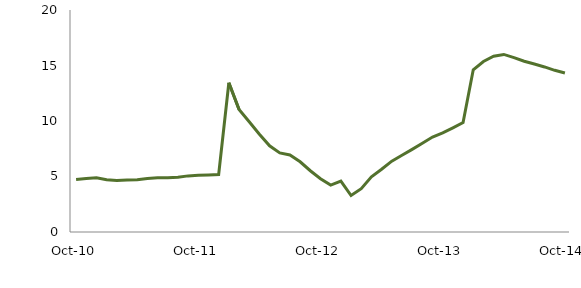
| Category | Series 0 |
|---|---|
| Oct-10 | 4.726 |
|  | 4.816 |
|  | 4.886 |
|  | 4.703 |
|  | 4.632 |
|  | 4.674 |
|  | 4.715 |
|  | 4.818 |
|  | 4.876 |
|  | 4.891 |
|  | 4.923 |
|  | 5.055 |
| Oct-11 | 5.115 |
|  | 5.14 |
|  | 5.184 |
|  | 13.448 |
|  | 11.044 |
|  | 9.928 |
|  | 8.811 |
|  | 7.762 |
|  | 7.121 |
|  | 6.936 |
|  | 6.325 |
|  | 5.519 |
| Oct-12 | 4.806 |
|  | 4.231 |
|  | 4.589 |
|  | 3.285 |
|  | 3.908 |
|  | 4.967 |
|  | 5.65 |
|  | 6.385 |
|  | 6.913 |
|  | 7.445 |
|  | 8.003 |
|  | 8.554 |
| Oct-13 | 8.933 |
|  | 9.386 |
|  | 9.861 |
|  | 14.619 |
|  | 15.361 |
|  | 15.84 |
|  | 15.998 |
|  | 15.703 |
|  | 15.38 |
|  | 15.129 |
|  | 14.869 |
|  | 14.566 |
| Oct-14 | 14.33 |